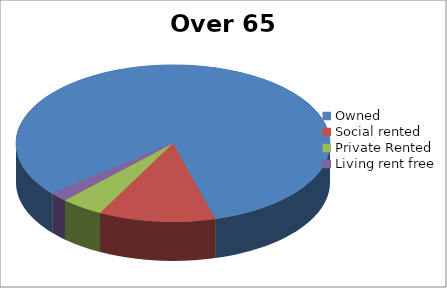
| Category | Over 65 |
|---|---|
| Owned | 88343 |
| Social rented | 12978 |
| Private Rented | 4727 |
| Living rent free | 1992 |